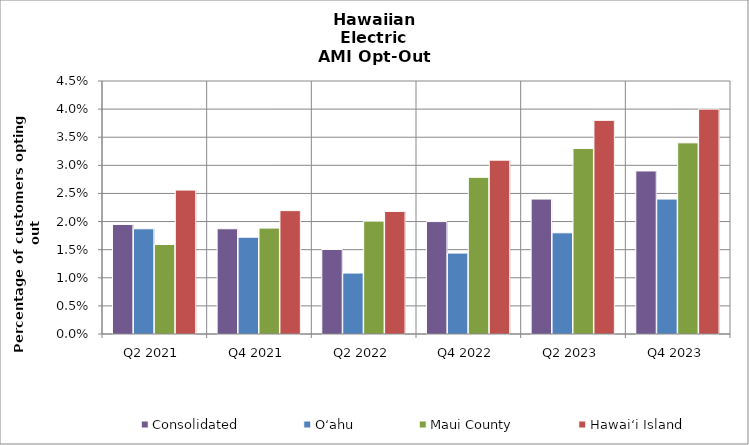
| Category | Consolidated | O‘ahu | Maui County | Hawai‘i Island |
|---|---|---|---|---|
| Q2 2021 | 0.019 | 0.019 | 0.016 | 0.026 |
| Q4 2021 | 0.019 | 0.017 | 0.019 | 0.022 |
| Q2 2022 | 0.015 | 0.011 | 0.02 | 0.022 |
| Q4 2022 | 0.02 | 0.014 | 0.028 | 0.031 |
| Q2 2023 | 0.024 | 0.018 | 0.033 | 0.038 |
| Q4 2023 | 0.029 | 0.024 | 0.034 | 0.04 |